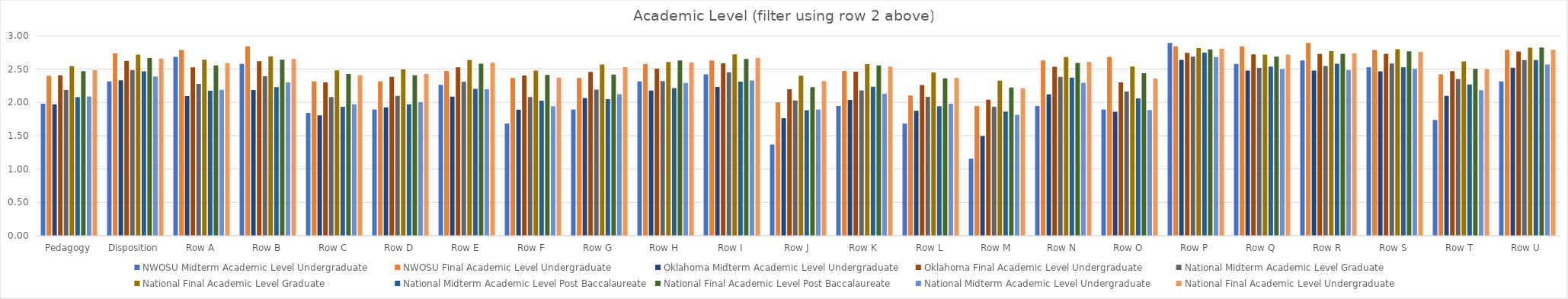
| Category | NWOSU | Oklahoma | National |
|---|---|---|---|
| Pedagogy | 2.401 | 2.407 | 2.484 |
| Disposition | 2.737 | 2.625 | 2.66 |
| Row A | 2.79 | 2.529 | 2.592 |
| Row B | 2.842 | 2.62 | 2.654 |
| Row C | 2.316 | 2.302 | 2.409 |
| Row D | 2.316 | 2.384 | 2.427 |
| Row E | 2.474 | 2.529 | 2.596 |
| Row F | 2.368 | 2.405 | 2.372 |
| Row G | 2.368 | 2.459 | 2.532 |
| Row H | 2.579 | 2.508 | 2.601 |
| Row I | 2.632 | 2.587 | 2.67 |
| Row J | 2 | 2.198 | 2.321 |
| Row K | 2.474 | 2.463 | 2.538 |
| Row L | 2.105 | 2.26 | 2.366 |
| Row M | 1.947 | 2.041 | 2.217 |
| Row N | 2.632 | 2.537 | 2.607 |
| Row O | 2.684 | 2.302 | 2.359 |
| Row P | 2.842 | 2.744 | 2.808 |
| Row Q | 2.842 | 2.723 | 2.72 |
| Row R | 2.895 | 2.727 | 2.738 |
| Row S | 2.79 | 2.731 | 2.759 |
| Row T | 2.421 | 2.471 | 2.5 |
| Row U | 2.79 | 2.764 | 2.79 |